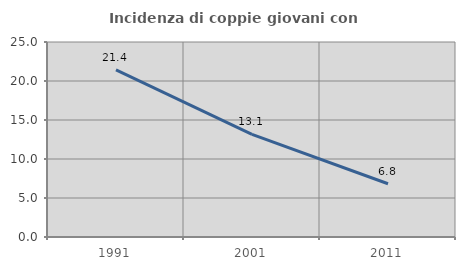
| Category | Incidenza di coppie giovani con figli |
|---|---|
| 1991.0 | 21.429 |
| 2001.0 | 13.15 |
| 2011.0 | 6.83 |